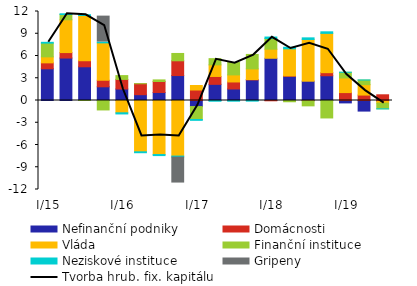
| Category | Nefinanční podniky | Domácnosti | Vláda | Finanční instituce | Neziskové instituce | Gripeny |
|---|---|---|---|---|---|---|
|  I/15 | 4.278 | 0.798 | 0.809 | 1.849 | 0.111 | 0 |
| II | 5.724 | 0.738 | 4.42 | 0.713 | 0.097 | 0 |
| III | 4.547 | 0.815 | 6.097 | -0.004 | 0.104 | 0 |
| IV | 1.849 | 0.883 | 5.042 | -1.273 | 0.104 | 3.5 |
|  I/16 | 1.549 | 1.292 | -1.657 | 0.516 | -0.156 | 0 |
| II | 0.783 | 1.476 | -6.917 | 0.005 | -0.124 | 0 |
| III | 1.084 | 1.478 | -7.287 | 0.214 | -0.14 | 0 |
| IV | 3.364 | 1.99 | -7.495 | 0.989 | -0.137 | -3.5 |
|  I/17 | -0.817 | 1.416 | 0.609 | -1.747 | -0.111 | 0 |
| II | 2.179 | 1.06 | 1.565 | 0.838 | -0.096 | 0 |
| III | 1.554 | 0.946 | 0.951 | 1.668 | -0.093 | 0 |
| IV | 2.776 | 0.043 | 1.443 | 1.948 | -0.085 | 0 |
|  I/18 | 5.695 | -0.039 | 1.223 | 1.445 | 0.194 | 0 |
| II | 3.266 | 0.048 | 3.651 | -0.17 | 0.213 | 0 |
| III | 2.602 | -0.04 | 5.627 | -0.681 | 0.217 | 0 |
| IV | 3.338 | 0.414 | 5.298 | -2.354 | 0.21 | 0 |
|  I/19 | -0.324 | 1.067 | 1.972 | 0.765 | 0.009 | 0 |
| II | -1.427 | 0.731 | 1.406 | 0.623 | 0.004 | 0 |
| III | -0.117 | 0.77 | -0.241 | -0.766 | -0.006 | 0 |